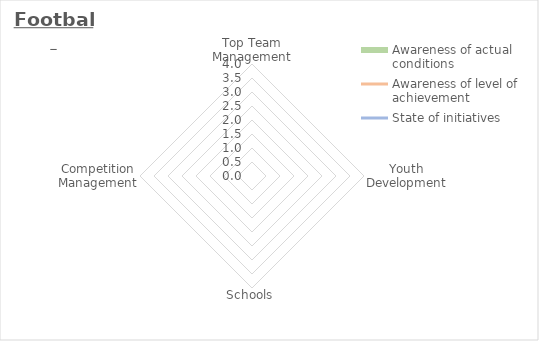
| Category | Awareness of actual conditions | Awareness of level of achievement | State of initiatives |
|---|---|---|---|
| 0 | 0 | 0 | 0 |
| 1 | 0 | 0 | 0 |
| 2 | 0 | 0 | 0 |
| 3 | 0 | 0 | 0 |